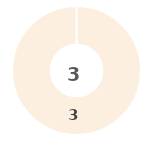
| Category | Series 0 |
|---|---|
| 0 | 0 |
| 1 | 0 |
| 2 | 0 |
| 3 | 0 |
| 4 | 3 |